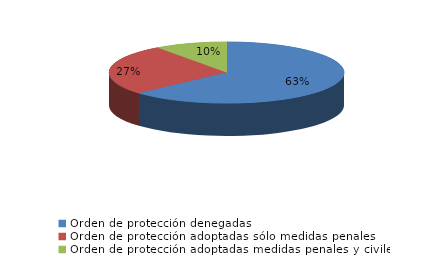
| Category | Series 0 |
|---|---|
| Orden de protección denegadas | 332 |
| Orden de protección adoptadas sólo medidas penales | 140 |
| Orden de protección adoptadas medidas penales y civiles | 52 |